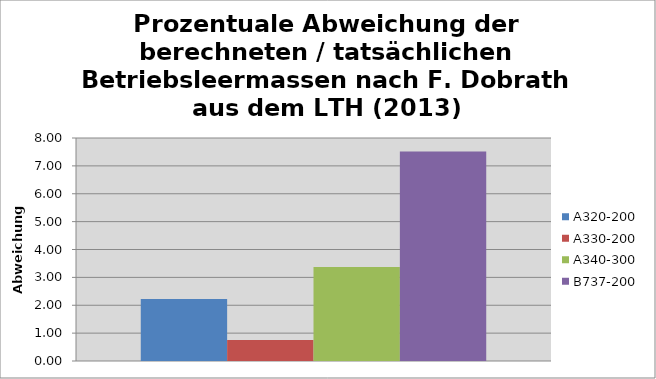
| Category | A320-200 | A330-200 | A340-300 | B737-200 |
|---|---|---|---|---|
| 0 | 2.227 | 0.752 | 3.369 | 7.518 |